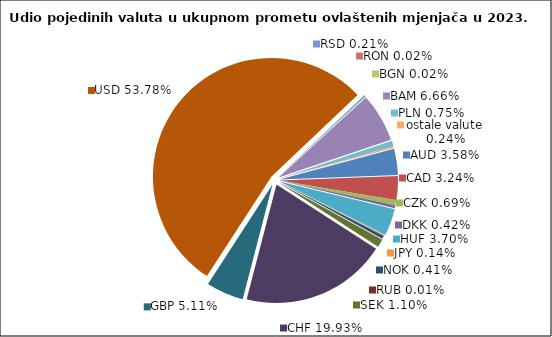
| Category | Series 0 |
|---|---|
| AUD | 3.578 |
| CAD | 3.245 |
| CZK | 0.685 |
| DKK | 0.422 |
| HUF | 3.701 |
| JPY | 0.136 |
| NOK | 0.411 |
| RUB | 0.012 |
| SEK | 1.099 |
| CHF | 19.929 |
| GBP | 5.113 |
| USD | 53.779 |
| RSD | 0.207 |
| RON | 0.02 |
| BGN | 0.019 |
| BAM | 6.661 |
| PLN | 0.748 |
| ostale valute | 0.235 |